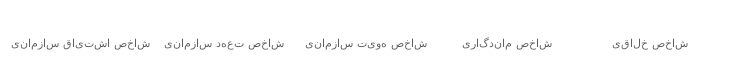
| Category | Series 0 |
|---|---|
| شاخص خلاقیت | 0.45 |
| شاخص ماندگاری | 0.32 |
| شاخص هویت سازمانی | 0.67 |
| شاخص تعهد سازمانی | 0.42 |
| شاخص اشتیاق سازمانی | 0.63 |